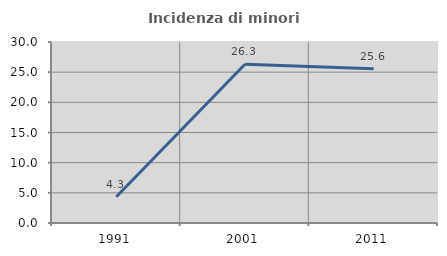
| Category | Incidenza di minori stranieri |
|---|---|
| 1991.0 | 4.348 |
| 2001.0 | 26.316 |
| 2011.0 | 25.558 |